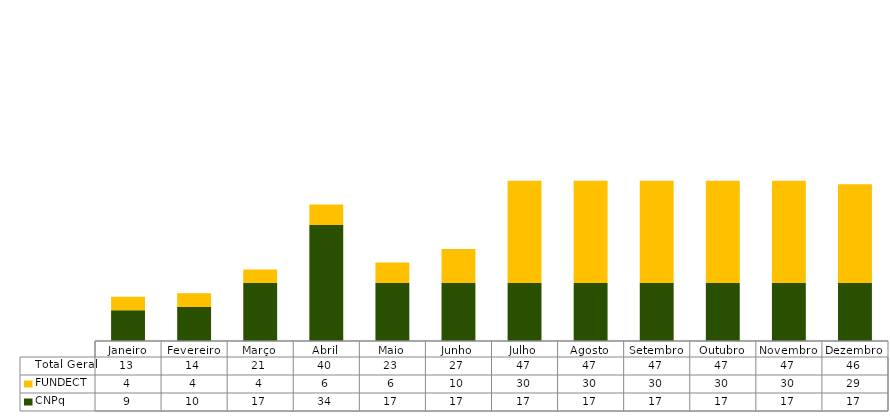
| Category | CNPq | FUNDECT | Total Geral |
|---|---|---|---|
| Janeiro | 9 | 4 | 13 |
| Fevereiro | 10 | 4 | 14 |
| Março | 17 | 4 | 21 |
| Abril | 34 | 6 | 40 |
| Maio | 17 | 6 | 23 |
| Junho | 17 | 10 | 27 |
| Julho | 17 | 30 | 47 |
| Agosto | 17 | 30 | 47 |
| Setembro | 17 | 30 | 47 |
| Outubro | 17 | 30 | 47 |
| Novembro | 17 | 30 | 47 |
| Dezembro | 17 | 29 | 46 |